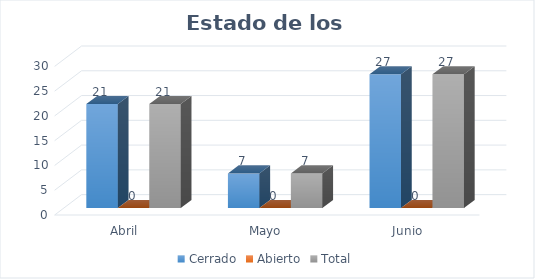
| Category | Cerrado | Abierto | Total |
|---|---|---|---|
| Abril | 21 | 0 | 21 |
| Mayo | 7 | 0 | 7 |
| Junio | 27 | 0 | 27 |